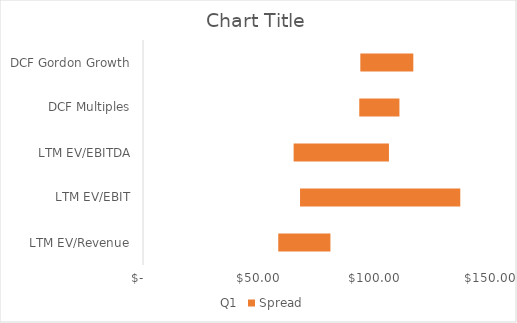
| Category | Q1 | Spread |
|---|---|---|
| LTM EV/Revenue | 58.303 | 22.486 |
| LTM EV/EBIT | 67.684 | 69.072 |
| LTM EV/EBITDA | 64.92 | 41.089 |
| DCF Multiples | 93.219 | 17.309 |
| DCF Gordon Growth | 93.677 | 22.837 |